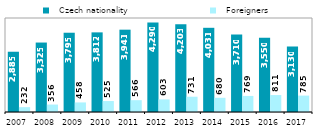
| Category |   Czech nationality |   Foreigners |
|---|---|---|
| 2007.0 | 2885 | 232 |
| 2008.0 | 3325 | 356 |
| 2009.0 | 3795 | 458 |
| 2010.0 | 3812 | 525 |
| 2011.0 | 3941 | 566 |
| 2012.0 | 4290 | 603 |
| 2013.0 | 4203 | 731 |
| 2014.0 | 4031 | 680 |
| 2015.0 | 3710 | 769 |
| 2016.0 | 3550 | 811 |
| 2017.0 | 3130 | 785 |